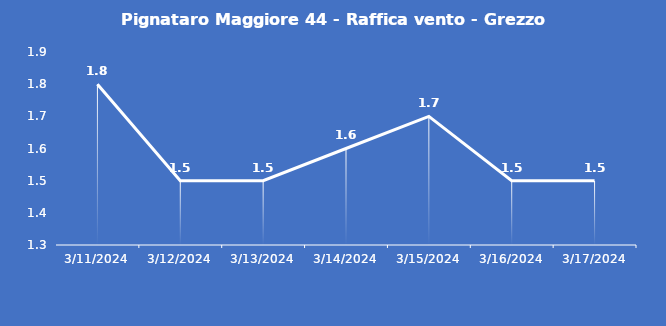
| Category | Pignataro Maggiore 44 - Raffica vento - Grezzo (m/s) |
|---|---|
| 3/11/24 | 1.8 |
| 3/12/24 | 1.5 |
| 3/13/24 | 1.5 |
| 3/14/24 | 1.6 |
| 3/15/24 | 1.7 |
| 3/16/24 | 1.5 |
| 3/17/24 | 1.5 |